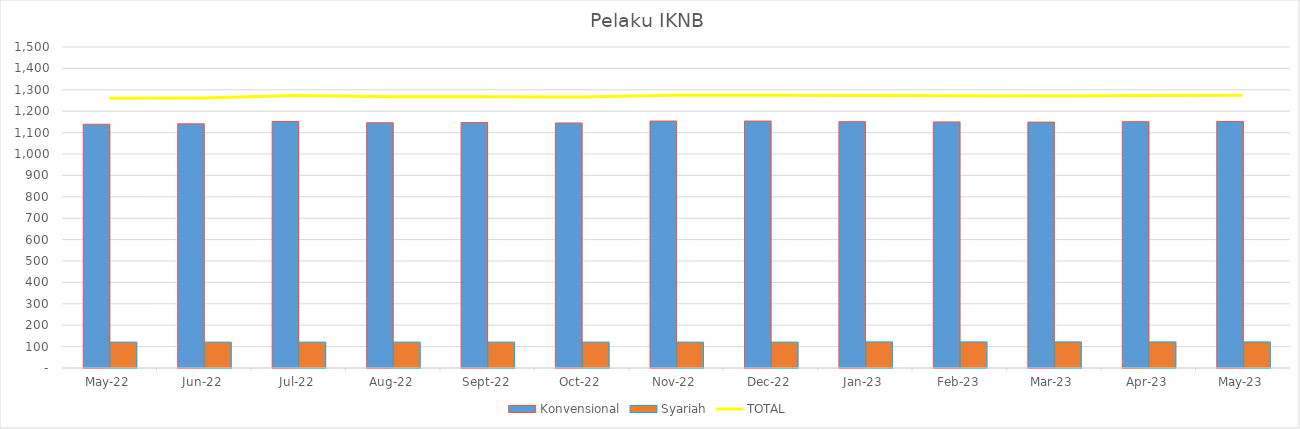
| Category |  Konvensional  |  Syariah  |
|---|---|---|
| 2022-05-01 | 1139 | 121 |
| 2022-06-01 | 1141 | 121 |
| 2022-07-01 | 1152 | 121 |
| 2022-08-01 | 1146 | 121 |
| 2022-09-01 | 1147 | 121 |
| 2022-10-01 | 1145 | 121 |
| 2022-11-01 | 1154 | 121 |
| 2022-12-01 | 1154 | 121 |
| 2023-01-01 | 1151 | 122 |
| 2023-02-01 | 1150 | 122 |
| 2023-03-01 | 1149 | 122 |
| 2023-04-01 | 1151 | 122 |
| 2023-05-01 | 1152 | 122 |